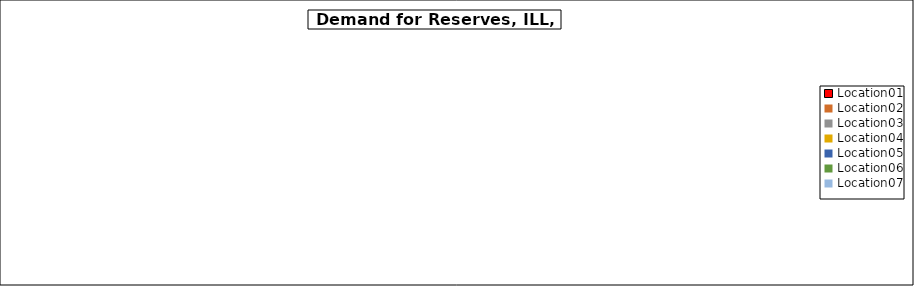
| Category | Data A |
|---|---|
| Location01 | 0 |
| Location02 | 0 |
| Location03 | 0 |
| Location04 | 0 |
| Location05 | 0 |
| Location06 | 0 |
| Location07 | 0 |